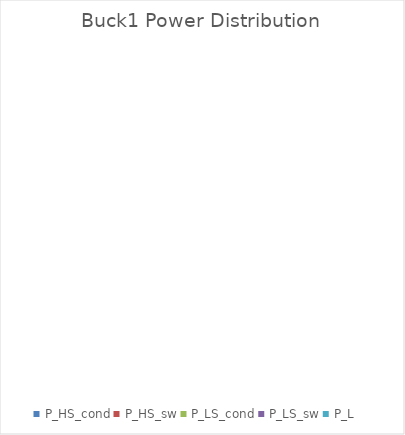
| Category | Buck1 Power Distribution |
|---|---|
| P_HS_cond | 0 |
| P_HS_sw | 0 |
| P_LS_cond | 0 |
| P_LS_sw | 0 |
| P_L | 0 |